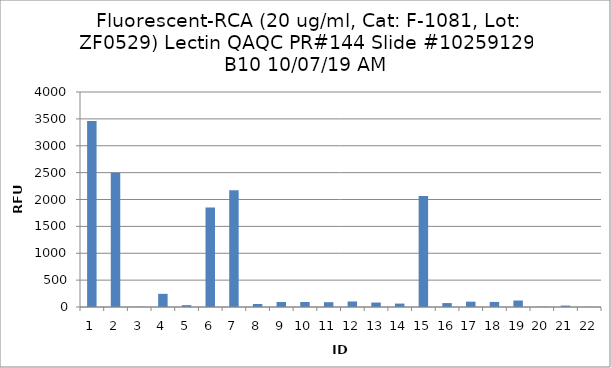
| Category | Series 0 |
|---|---|
| 0 | 3459.25 |
| 1 | 2496.25 |
| 2 | 4.5 |
| 3 | 245 |
| 4 | 34.5 |
| 5 | 1851.5 |
| 6 | 2170.25 |
| 7 | 55.5 |
| 8 | 93.5 |
| 9 | 93.5 |
| 10 | 89.5 |
| 11 | 102.5 |
| 12 | 83 |
| 13 | 63.75 |
| 14 | 2065.75 |
| 15 | 73.25 |
| 16 | 99.25 |
| 17 | 94.25 |
| 18 | 120.75 |
| 19 | 5.25 |
| 20 | 26.5 |
| 21 | 1.5 |